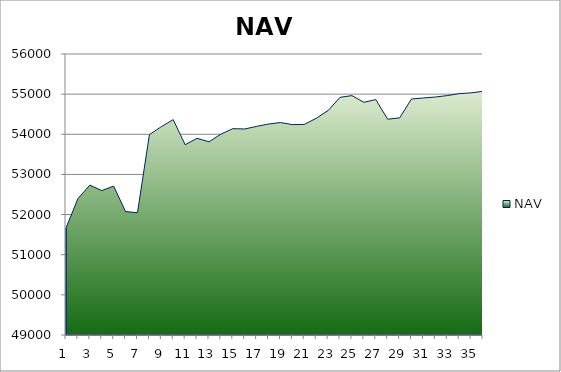
| Category | NAV |
|---|---|
| 0 | 51667 |
| 1 | 52397 |
| 2 | 52733.957 |
| 3 | 52597.875 |
| 4 | 52708.772 |
| 5 | 52075.184 |
| 6 | 52046.775 |
| 7 | 53991.219 |
| 8 | 54189.909 |
| 9 | 54364.909 |
| 10 | 53739.909 |
| 11 | 53899.542 |
| 12 | 53812.294 |
| 13 | 54003.961 |
| 14 | 54140.037 |
| 15 | 54132.37 |
| 16 | 54197.37 |
| 17 | 54255.812 |
| 18 | 54292.622 |
| 19 | 54240.699 |
| 20 | 54246.834 |
| 21 | 54397.391 |
| 22 | 54592.197 |
| 23 | 54920.119 |
| 24 | 54963.245 |
| 25 | 54796.799 |
| 26 | 54863.963 |
| 27 | 54375.975 |
| 28 | 54409.015 |
| 29 | 54878.402 |
| 30 | 54905.151 |
| 31 | 54927.958 |
| 32 | 54964.157 |
| 33 | 55012.385 |
| 34 | 55031.616 |
| 35 | 55070.791 |